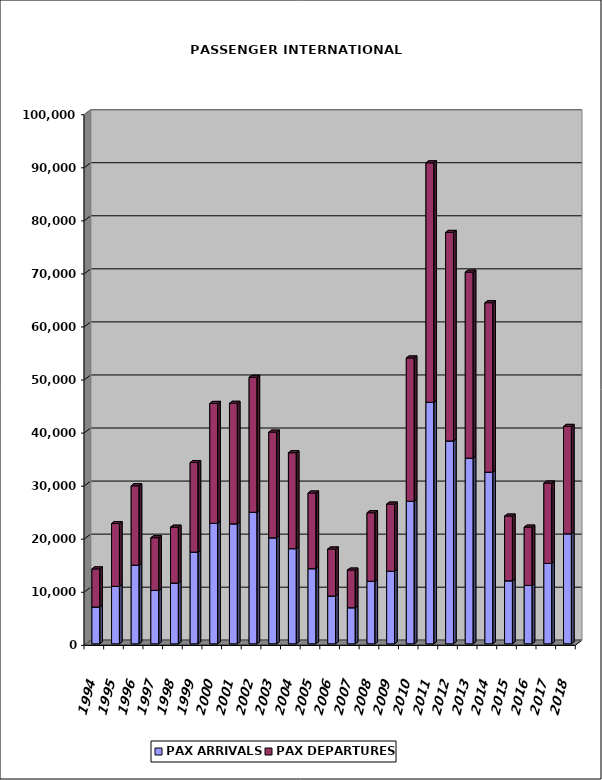
| Category | PAX ARRIVALS | PAX DEPARTURES |
|---|---|---|
| 1994.0 | 6929 | 7189 |
| 1995.0 | 10823 | 11843 |
| 1996.0 | 14831 | 14946 |
| 1997.0 | 10071 | 9926 |
| 1998.0 | 11447 | 10534 |
| 1999.0 | 17279 | 16887 |
| 2000.0 | 22700 | 22608 |
| 2001.0 | 22610 | 22720 |
| 2002.0 | 24790 | 25439 |
| 2003.0 | 19974 | 19930 |
| 2004.0 | 17936 | 18070 |
| 2005.0 | 14161 | 14258 |
| 2006.0 | 9000 | 8869 |
| 2007.0 | 6800 | 7098 |
| 2008.0 | 11787 | 12913 |
| 2009.0 | 13675 | 12665 |
| 2010.0 | 26867 | 27007 |
| 2011.0 | 45514 | 45140 |
| 2012.0 | 38238 | 39298 |
| 2013.0 | 34986 | 35075 |
| 2014.0 | 32346 | 31940 |
| 2015.0 | 11881 | 12198 |
| 2016.0 | 11002 | 10993 |
| 2017.0 | 15142 | 15155 |
| 2018.0 | 20737 | 20240 |